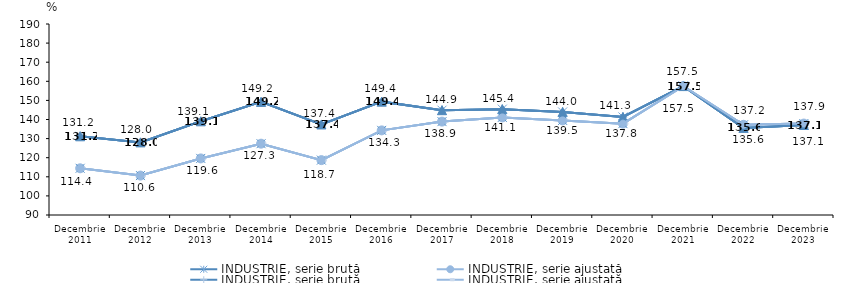
| Category | INDUSTRIE, serie brută | INDUSTRIE, serie ajustată |
|---|---|---|
| Decembrie
2011 | 131.206 | 114.449 |
| Decembrie
2012 | 128.022 | 110.635 |
| Decembrie
2013 | 139.055 | 119.623 |
| Decembrie
2014 | 149.227 | 127.343 |
| Decembrie
2015 | 137.392 | 118.733 |
| Decembrie
2016 | 149.352 | 134.305 |
| Decembrie
2017 | 144.873 | 138.902 |
| Decembrie
2018 | 145.416 | 141.094 |
| Decembrie
2019 | 143.959 | 139.529 |
| Decembrie
2020 | 141.329 | 137.841 |
| Decembrie
2021 | 157.496 | 157.495 |
| Decembrie
2022 | 135.609 | 137.232 |
| Decembrie
2023 | 137.113 | 137.877 |